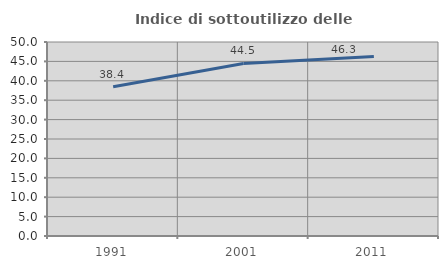
| Category | Indice di sottoutilizzo delle abitazioni  |
|---|---|
| 1991.0 | 38.449 |
| 2001.0 | 44.483 |
| 2011.0 | 46.258 |